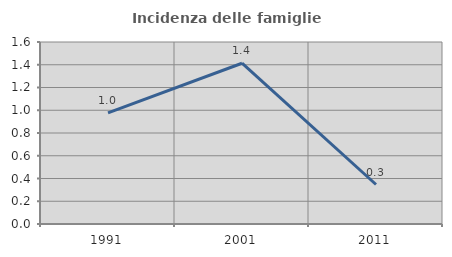
| Category | Incidenza delle famiglie numerose |
|---|---|
| 1991.0 | 0.977 |
| 2001.0 | 1.413 |
| 2011.0 | 0.347 |